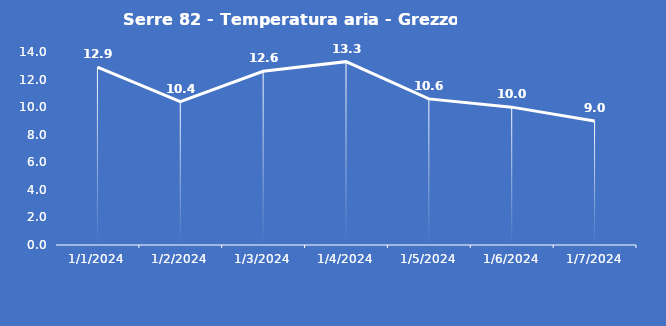
| Category | Serre 82 - Temperatura aria - Grezzo (°C) |
|---|---|
| 1/1/24 | 12.9 |
| 1/2/24 | 10.4 |
| 1/3/24 | 12.6 |
| 1/4/24 | 13.3 |
| 1/5/24 | 10.6 |
| 1/6/24 | 10 |
| 1/7/24 | 9 |